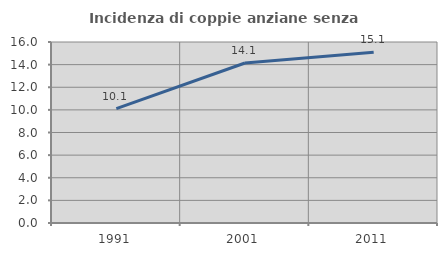
| Category | Incidenza di coppie anziane senza figli  |
|---|---|
| 1991.0 | 10.112 |
| 2001.0 | 14.141 |
| 2011.0 | 15.094 |